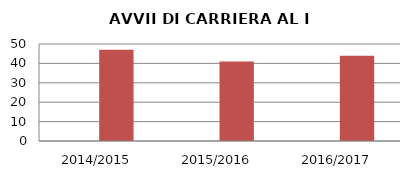
| Category | ANNO | NUMERO |
|---|---|---|
| 2014/2015 | 0 | 47 |
| 2015/2016 | 0 | 41 |
| 2016/2017 | 0 | 44 |